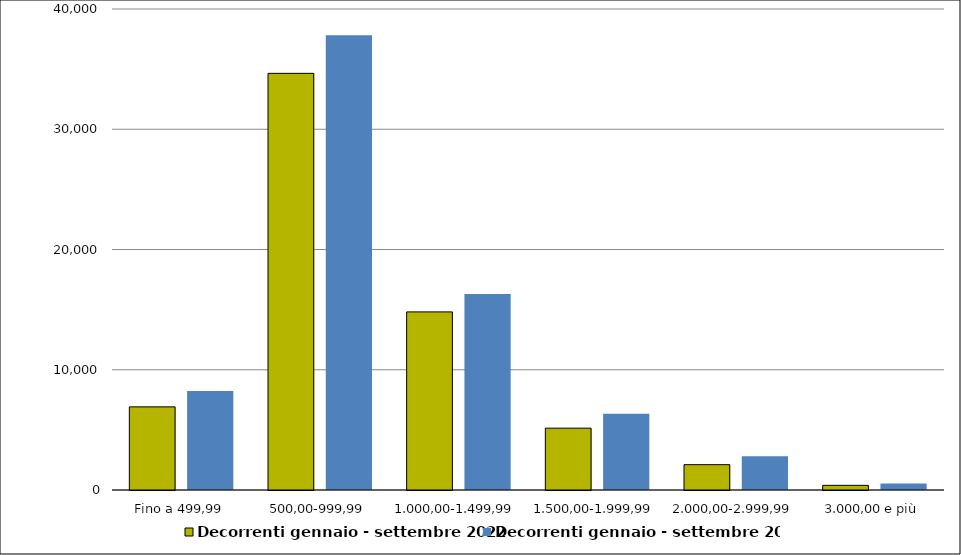
| Category | Decorrenti gennaio - settembre 2022 | Decorrenti gennaio - settembre 2021 |
|---|---|---|
| Fino a 499,99 | 6913 | 8224 |
| 500,00-999,99 | 34648 | 37824 |
| 1.000,00-1.499,99 | 14811 | 16307 |
| 1.500,00-1.999,99 | 5142 | 6345 |
| 2.000,00-2.999,99 | 2107 | 2805 |
| 3.000,00 e più | 387 | 532 |